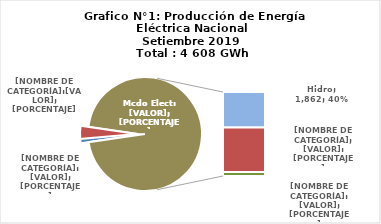
| Category | Series 0 |
|---|---|
| 0 | 42.39 |
| 1 | 169.56 |
| 2 | 1862.344 |
| 3 | 2318.274 |
| 4 | 215.038 |